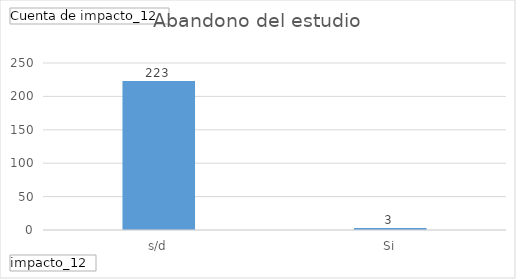
| Category | Total |
|---|---|
| s/d | 223 |
| Si | 3 |